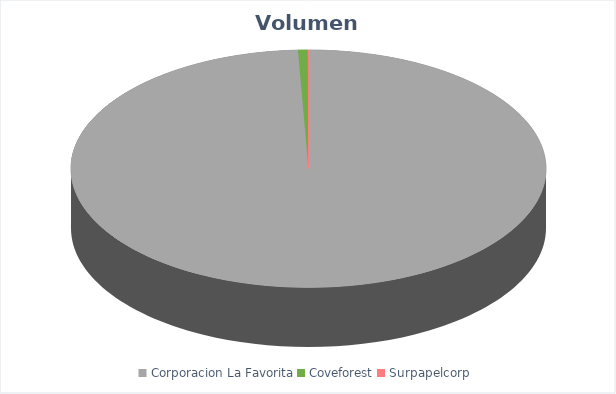
| Category | VOLUMEN ($USD) |
|---|---|
| Corporacion La Favorita | 231277.63 |
| Coveforest | 1500.2 |
| Surpapelcorp | 136 |